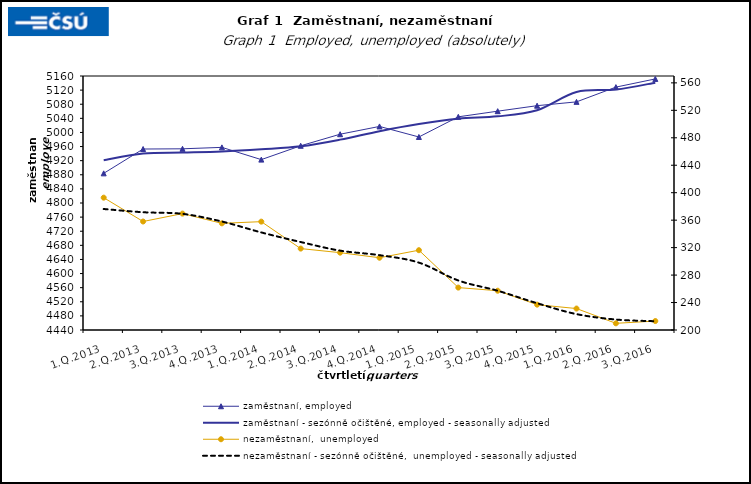
| Category | zaměstnaní, employed | zaměstnaní - sezónně očištěné, employed - seasonally adjusted |
|---|---|---|
| 1.Q.2013 | 4884.025 | 4921.298 |
| 2.Q.2013 | 4952.991 | 4940.38 |
| 3.Q.2013 | 4953.606 | 4943.118 |
| 4.Q.2013 | 4957.713 | 4946.225 |
| 1.Q.2014 | 4922.963 | 4952.405 |
| 2.Q.2014 | 4962.219 | 4960.65 |
| 3.Q.2014 | 4994.947 | 4979.618 |
| 4.Q.2014 | 5017.051 | 5003.629 |
| 1.Q.2015 | 4987.141 | 5023.827 |
| 2.Q.2015 | 5044.285 | 5038.984 |
| 3.Q.2015 | 5060.3 | 5045.647 |
| 4.Q.2015 | 5075.884 | 5063.085 |
| 1.Q.2016 | 5086.671 | 5114.698 |
| 2.Q.2016 | 5128.493 | 5121.602 |
| 3.Q.2016 | 5151.712 | 5140.967 |